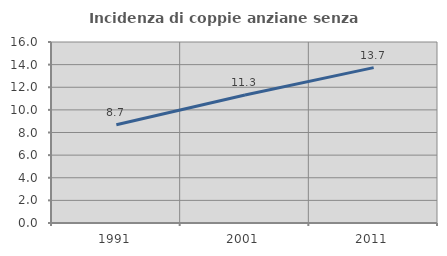
| Category | Incidenza di coppie anziane senza figli  |
|---|---|
| 1991.0 | 8.682 |
| 2001.0 | 11.321 |
| 2011.0 | 13.732 |